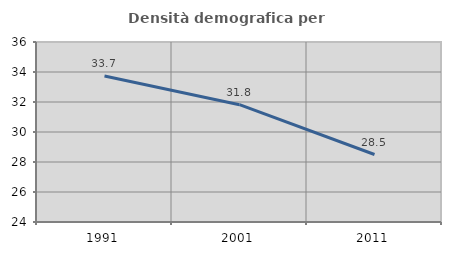
| Category | Densità demografica |
|---|---|
| 1991.0 | 33.73 |
| 2001.0 | 31.821 |
| 2011.0 | 28.499 |